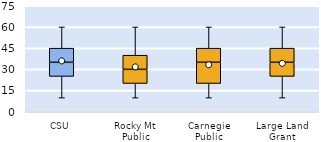
| Category | 25th | 50th | 75th |
|---|---|---|---|
| CSU | 25 | 10 | 10 |
| Rocky Mt Public | 20 | 10 | 10 |
| Carnegie Public | 20 | 15 | 10 |
| Large Land Grant | 25 | 10 | 10 |